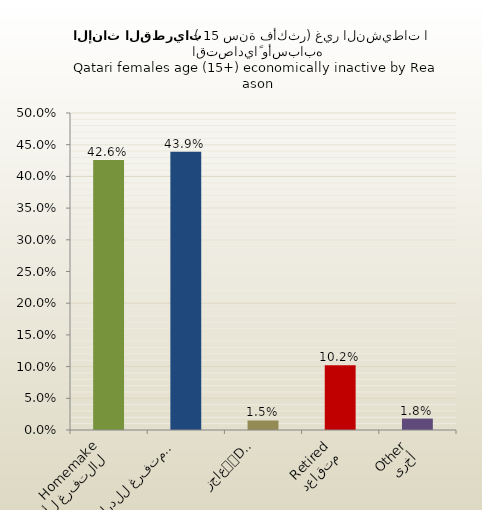
| Category | الاناث القطريات |
|---|---|
| التفرغ لأعمال المنزل
Homemaker | 0.426 |
| متفرغ للدراسة
Student | 0.439 |
| عاجز
Disabled | 0.015 |
| متقاعد
Retired | 0.102 |
| أخرى
Other | 0.018 |